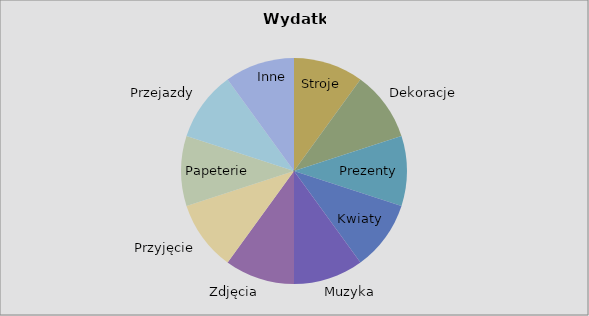
| Category | Kwota |
|---|---|
| Stroje | 1 |
| Dekoracje | 1 |
| Prezenty | 1 |
| Kwiaty | 1 |
| Muzyka | 1 |
| Zdjęcia | 1 |
| Przyjęcie | 1 |
| Papeterie | 1 |
| Przejazdy | 1 |
| Inne | 1 |